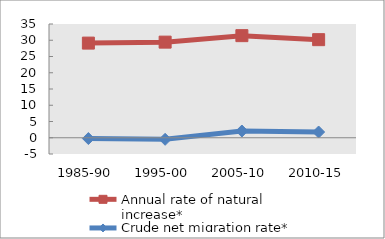
| Category | Annual rate of natural increase* | Crude net migration rate* |
|---|---|---|
| 1985-90 | 29.124 | -0.249 |
| 1995-00 | 29.422 | -0.484 |
| 2005-10 | 31.414 | 2.076 |
| 2010-15 | 30.178 | 1.763 |